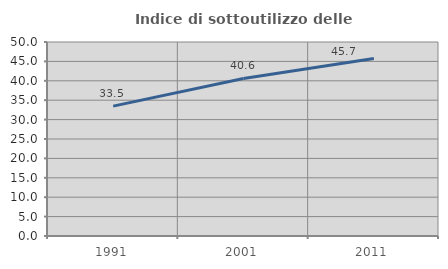
| Category | Indice di sottoutilizzo delle abitazioni  |
|---|---|
| 1991.0 | 33.474 |
| 2001.0 | 40.614 |
| 2011.0 | 45.742 |